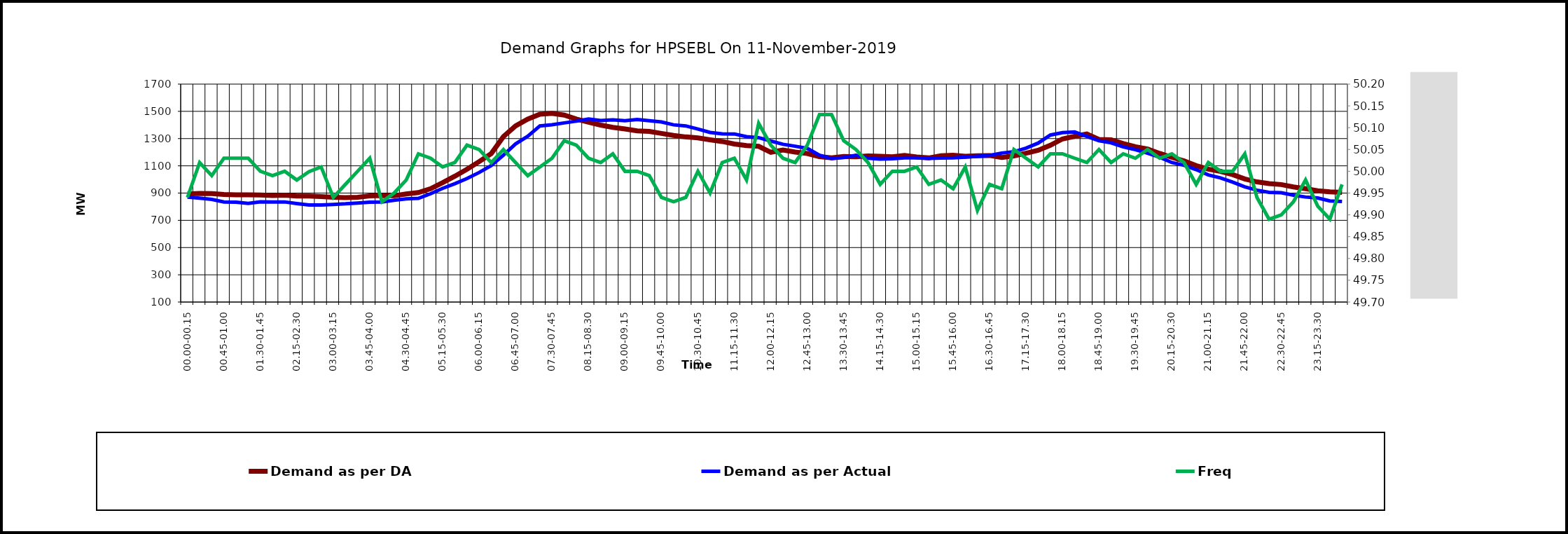
| Category | Demand as per DA | Demand as per Actual |
|---|---|---|
| 00.00-00.15 | 893.143 | 870 |
| 00.15-00.30 | 897.128 | 863 |
| 00.30-00.45 | 895.883 | 854 |
| 00.45-01.00 | 889.407 | 835 |
| 01.00-01.15 | 886.667 | 833 |
| 01.15-01.30 | 887.664 | 824 |
| 01.30-01.45 | 886.418 | 836 |
| 01.45-02:00 | 882.184 | 834 |
| 02.00-02.15 | 884.924 | 835 |
| 02.15-02.30 | 877.95 | 823 |
| 02.30-02.45 | 878.199 | 813 |
| 02.45-03:00 | 873.716 | 813 |
| 03.00-03.15 | 869.233 | 817 |
| 03.15-03.30 | 866.244 | 821 |
| 03.30-03.45 | 869.233 | 827 |
| 03.45-04.00 | 879.694 | 833 |
| 04.00-04.15 | 881.686 | 834 |
| 04.15-04.30 | 880.192 | 847 |
| 04.30-04.45 | 893.641 | 857 |
| 04.45-05.00 | 903.853 | 861 |
| 05.00-05.15 | 931.997 | 895 |
| 05.15-05.30 | 976.33 | 935 |
| 05.30-05.45 | 1023.653 | 969 |
| 05.45-06.00 | 1074.96 | 1007 |
| 06.00-06.15 | 1130.999 | 1051 |
| 06.15-06.30 | 1190.276 | 1102 |
| 06.30-06.45 | 1314.31 | 1179 |
| 06.45-07.00 | 1392.765 | 1261 |
| 07.00-07.15 | 1443.076 | 1317 |
| 07.15-07.30 | 1478.692 | 1393 |
| 07.30-07.45 | 1485.168 | 1402 |
| 07.45-08.00 | 1472.466 | 1415 |
| 08.00-08.15 | 1443.325 | 1428 |
| 08.15-08.30 | 1420.66 | 1444 |
| 08.30-08.45 | 1398.992 | 1433 |
| 08.45-09.00 | 1382.305 | 1437 |
| 09.00-09.15 | 1371.113 | 1431 |
| 09.15-09.30 | 1356.651 | 1440 |
| 09.30-09.45 | 1352.417 | 1431 |
| 09.45-10.00 | 1337.722 | 1422 |
| 10.00-10.15 | 1323.276 | 1401 |
| 10.15-10.30 | 1312.318 | 1393 |
| 10.30-10.45 | 1305.095 | 1370 |
| 10.45-11.00 | 1290.898 | 1345 |
| 11.00-11.15 | 1278.445 | 1335 |
| 11.15-11.30 | 1260.512 | 1334 |
| 11.30-11.45 | 1248.806 | 1314 |
| 11.45-12.00 | 1243.078 | 1307 |
| 12.00-12.15 | 1199.492 | 1282 |
| 12.15-12.30 | 1216.179 | 1258 |
| 12.30-12.45 | 1200.986 | 1244 |
| 12.45-13.00 | 1190.525 | 1228 |
| 13.00-13.15 | 1167.113 | 1178 |
| 13.15-13.30 | 1158.396 | 1153 |
| 13.30-13.45 | 1168.359 | 1161 |
| 13.45-14.00 | 1166.117 | 1177 |
| 14.00-14.15 | 1172.344 | 1156 |
| 14.15-14.30 | 1170.351 | 1150 |
| 14.30-14.45 | 1166.117 | 1152 |
| 14.45-15.00 | 1175.831 | 1158 |
| 15.00-15.15 | 1164.457 | 1159 |
| 15.15-15.30 | 1158.147 | 1155 |
| 15.30-15.45 | 1174.336 | 1157 |
| 15.45-16.00 | 1177.823 | 1158 |
| 16.00-16.15 | 1170.102 | 1164 |
| 16.15-16.30 | 1174.336 | 1170 |
| 16.30-16.45 | 1175.831 | 1177 |
| 16.45-17.00 | 1161.385 | 1194 |
| 17.00-17.15 | 1172.842 | 1203 |
| 17.15-17.30 | 1192.767 | 1230 |
| 17.30-17.45 | 1213.937 | 1267 |
| 17.45-18.00 | 1250.55 | 1326 |
| 18.00-18.15 | 1297.374 | 1344 |
| 18.15-18.30 | 1316.552 | 1349 |
| 18.30-18.45 | 1333.488 | 1316 |
| 18.45-19.00 | 1293.638 | 1284 |
| 19.00-19.15 | 1290.483 | 1269 |
| 19.15-19.30 | 1263.003 | 1239 |
| 19.30-19.45 | 1240.089 | 1219 |
| 19.45-20.00 | 1222.904 | 1193 |
| 20.00-20.15 | 1191.023 | 1163 |
| 20.15-20.30 | 1162.381 | 1124 |
| 20.30-20.45 | 1135.731 | 1104 |
| 20.45-21.00 | 1101.36 | 1072 |
| 21.00-21.15 | 1075.209 | 1033 |
| 21.15-21.30 | 1059.518 | 1011 |
| 21.30-21.45 | 1035.857 | 980 |
| 21.45-22.00 | 1003.727 | 946 |
| 22.00-22.15 | 982.059 | 921 |
| 22.15-22.30 | 969.606 | 905 |
| 22.30-22.45 | 962.383 | 902 |
| 22.45-23.00 | 945.197 | 885 |
| 23.00-23.15 | 932.495 | 871 |
| 23.15-23.30 | 917.053 | 864 |
| 23.30-23.45 | 908.585 | 842 |
| 23.45-24.00 | 904.6 | 838 |